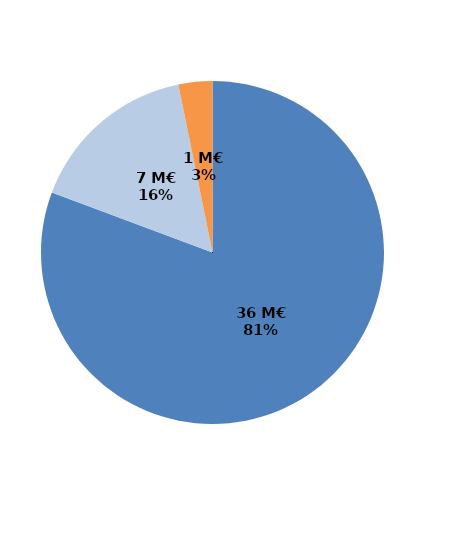
| Category | Series 0 |
|---|---|
| Formations certifiantes et pré-certifiantes | 35.878 |
| Formations professionnalisantes | 7.163 |
| Formations d'insertion sociale et professionnelle | 1.419 |